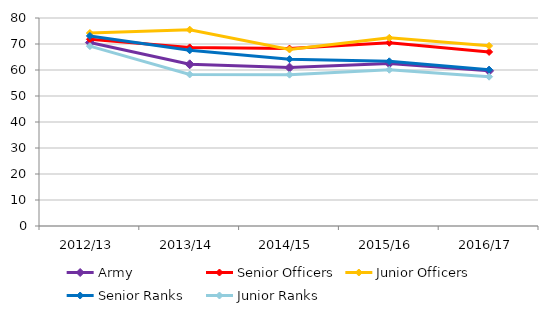
| Category | Army | Senior Officers | Junior Officers | Senior Ranks | Junior Ranks |
|---|---|---|---|---|---|
| 2012/13 | 70.549 | 71.789 | 74.225 | 73.11 | 69.18 |
| 2013/14 | 62.189 | 68.691 | 75.506 | 67.563 | 58.289 |
| 2014/15 | 60.923 | 68.244 | 67.891 | 64.164 | 58.206 |
| 2015/16 | 62.519 | 70.478 | 72.378 | 63.341 | 60.105 |
| 2016/17 | 59.663 | 66.954 | 69.281 | 60.117 | 57.428 |